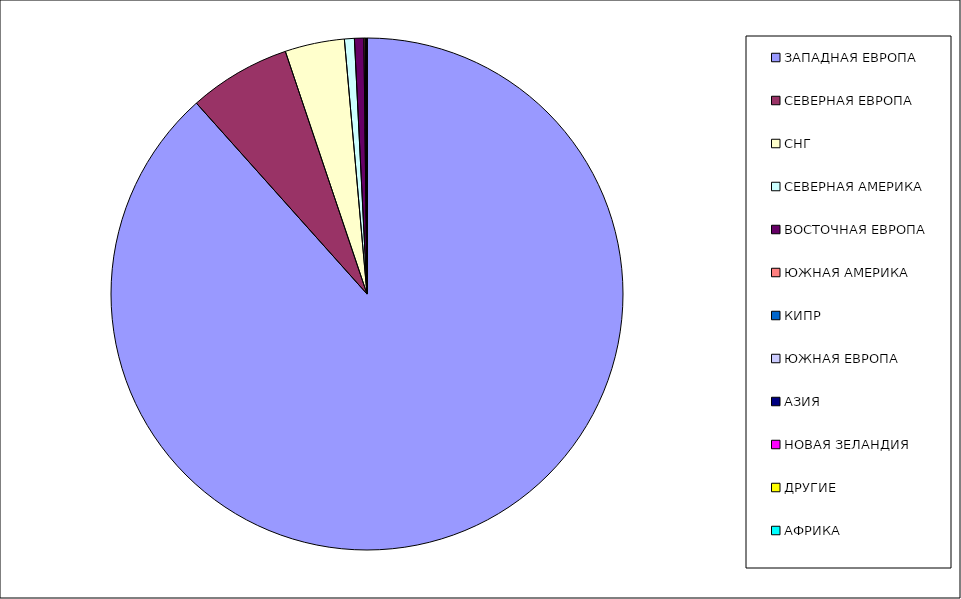
| Category | Оборот |
|---|---|
| ЗАПАДНАЯ ЕВРОПА | 0.884 |
| СЕВЕРНАЯ ЕВРОПА | 0.064 |
| СНГ | 0.038 |
| СЕВЕРНАЯ АМЕРИКА | 0.006 |
| ВОСТОЧНАЯ ЕВРОПА | 0.006 |
| ЮЖНАЯ АМЕРИКА | 0.001 |
| КИПР | 0 |
| ЮЖНАЯ ЕВРОПА | 0 |
| АЗИЯ | 0 |
| НОВАЯ ЗЕЛАНДИЯ | 0 |
| ДРУГИЕ | 0 |
| АФРИКА | 0 |